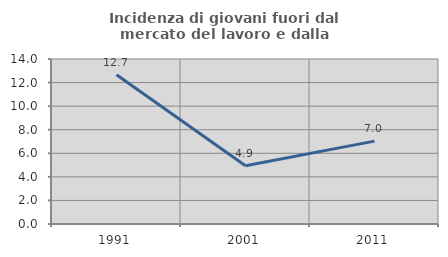
| Category | Incidenza di giovani fuori dal mercato del lavoro e dalla formazione  |
|---|---|
| 1991.0 | 12.669 |
| 2001.0 | 4.943 |
| 2011.0 | 7.034 |